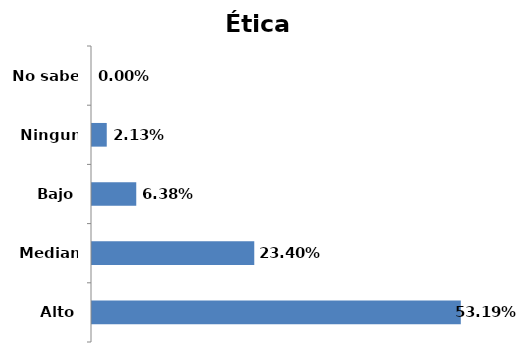
| Category | Series 0 |
|---|---|
| Alto | 0.532 |
| Mediano | 0.234 |
| Bajo | 0.064 |
| Ninguno | 0.021 |
| No sabe | 0 |